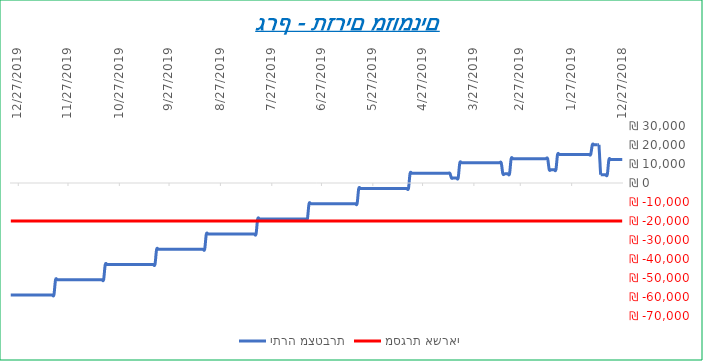
| Category | יתרה מצטברת | מסגרת אשראי |
|---|---|---|
| 2018-12-27 | 12345 | -20000 |
| 2018-12-28 | 12345 | -20000 |
| 2018-12-29 | 12345 | -20000 |
| 2018-12-30 | 12345 | -20000 |
| 2018-12-31 | 12345 | -20000 |
| 2019-01-01 | 12345 | -20000 |
| 2019-01-02 | 12345 | -20000 |
| 2019-01-03 | 12345 | -20000 |
| 2019-01-04 | 12345 | -20000 |
| 2019-01-05 | 4345 | -20000 |
| 2019-01-06 | 4345 | -20000 |
| 2019-01-07 | 4345 | -20000 |
| 2019-01-08 | 4345 | -20000 |
| 2019-01-09 | 4345 | -20000 |
| 2019-01-10 | 20145 | -20000 |
| 2019-01-11 | 20145 | -20000 |
| 2019-01-12 | 20145 | -20000 |
| 2019-01-13 | 20145 | -20000 |
| 2019-01-14 | 20145 | -20000 |
| 2019-01-15 | 15011 | -20000 |
| 2019-01-16 | 15011 | -20000 |
| 2019-01-17 | 15011 | -20000 |
| 2019-01-18 | 15011 | -20000 |
| 2019-01-19 | 15011 | -20000 |
| 2019-01-20 | 15011 | -20000 |
| 2019-01-21 | 15011 | -20000 |
| 2019-01-22 | 15011 | -20000 |
| 2019-01-23 | 15011 | -20000 |
| 2019-01-24 | 15011 | -20000 |
| 2019-01-25 | 15011 | -20000 |
| 2019-01-26 | 15011 | -20000 |
| 2019-01-27 | 15011 | -20000 |
| 2019-01-28 | 15011 | -20000 |
| 2019-01-29 | 15011 | -20000 |
| 2019-01-30 | 15011 | -20000 |
| 2019-01-31 | 15011 | -20000 |
| 2019-02-01 | 15011 | -20000 |
| 2019-02-02 | 15011 | -20000 |
| 2019-02-03 | 15011 | -20000 |
| 2019-02-04 | 15011 | -20000 |
| 2019-02-05 | 7011 | -20000 |
| 2019-02-06 | 7011 | -20000 |
| 2019-02-07 | 7011 | -20000 |
| 2019-02-08 | 7011 | -20000 |
| 2019-02-09 | 7011 | -20000 |
| 2019-02-10 | 12811 | -20000 |
| 2019-02-11 | 12811 | -20000 |
| 2019-02-12 | 12811 | -20000 |
| 2019-02-13 | 12811 | -20000 |
| 2019-02-14 | 12811 | -20000 |
| 2019-02-15 | 12811 | -20000 |
| 2019-02-16 | 12811 | -20000 |
| 2019-02-17 | 12811 | -20000 |
| 2019-02-18 | 12811 | -20000 |
| 2019-02-19 | 12811 | -20000 |
| 2019-02-20 | 12811 | -20000 |
| 2019-02-21 | 12811 | -20000 |
| 2019-02-22 | 12811 | -20000 |
| 2019-02-23 | 12811 | -20000 |
| 2019-02-24 | 12811 | -20000 |
| 2019-02-25 | 12811 | -20000 |
| 2019-02-26 | 12811 | -20000 |
| 2019-02-27 | 12811 | -20000 |
| 2019-02-28 | 12811 | -20000 |
| 2019-03-01 | 12811 | -20000 |
| 2019-03-02 | 12811 | -20000 |
| 2019-03-03 | 12811 | -20000 |
| 2019-03-04 | 12811 | -20000 |
| 2019-03-05 | 4811 | -20000 |
| 2019-03-06 | 4811 | -20000 |
| 2019-03-07 | 4811 | -20000 |
| 2019-03-08 | 4811 | -20000 |
| 2019-03-09 | 4811 | -20000 |
| 2019-03-10 | 10611 | -20000 |
| 2019-03-11 | 10611 | -20000 |
| 2019-03-12 | 10611 | -20000 |
| 2019-03-13 | 10611 | -20000 |
| 2019-03-14 | 10611 | -20000 |
| 2019-03-15 | 10611 | -20000 |
| 2019-03-16 | 10611 | -20000 |
| 2019-03-17 | 10611 | -20000 |
| 2019-03-18 | 10611 | -20000 |
| 2019-03-19 | 10611 | -20000 |
| 2019-03-20 | 10611 | -20000 |
| 2019-03-21 | 10611 | -20000 |
| 2019-03-22 | 10611 | -20000 |
| 2019-03-23 | 10611 | -20000 |
| 2019-03-24 | 10611 | -20000 |
| 2019-03-25 | 10611 | -20000 |
| 2019-03-26 | 10611 | -20000 |
| 2019-03-27 | 10611 | -20000 |
| 2019-03-28 | 10611 | -20000 |
| 2019-03-29 | 10611 | -20000 |
| 2019-03-30 | 10611 | -20000 |
| 2019-03-31 | 10611 | -20000 |
| 2019-04-01 | 10611 | -20000 |
| 2019-04-02 | 10611 | -20000 |
| 2019-04-03 | 10611 | -20000 |
| 2019-04-04 | 10611 | -20000 |
| 2019-04-05 | 2611 | -20000 |
| 2019-04-06 | 2611 | -20000 |
| 2019-04-07 | 2611 | -20000 |
| 2019-04-08 | 2611 | -20000 |
| 2019-04-09 | 2611 | -20000 |
| 2019-04-10 | 5111 | -20000 |
| 2019-04-11 | 5111 | -20000 |
| 2019-04-12 | 5111 | -20000 |
| 2019-04-13 | 5111 | -20000 |
| 2019-04-14 | 5111 | -20000 |
| 2019-04-15 | 5111 | -20000 |
| 2019-04-16 | 5111 | -20000 |
| 2019-04-17 | 5111 | -20000 |
| 2019-04-18 | 5111 | -20000 |
| 2019-04-19 | 5111 | -20000 |
| 2019-04-20 | 5111 | -20000 |
| 2019-04-21 | 5111 | -20000 |
| 2019-04-22 | 5111 | -20000 |
| 2019-04-23 | 5111 | -20000 |
| 2019-04-24 | 5111 | -20000 |
| 2019-04-25 | 5111 | -20000 |
| 2019-04-26 | 5111 | -20000 |
| 2019-04-27 | 5111 | -20000 |
| 2019-04-28 | 5111 | -20000 |
| 2019-04-29 | 5111 | -20000 |
| 2019-04-30 | 5111 | -20000 |
| 2019-05-01 | 5111 | -20000 |
| 2019-05-02 | 5111 | -20000 |
| 2019-05-03 | 5111 | -20000 |
| 2019-05-04 | 5111 | -20000 |
| 2019-05-05 | -2889 | -20000 |
| 2019-05-06 | -2889 | -20000 |
| 2019-05-07 | -2889 | -20000 |
| 2019-05-08 | -2889 | -20000 |
| 2019-05-09 | -2889 | -20000 |
| 2019-05-10 | -2889 | -20000 |
| 2019-05-11 | -2889 | -20000 |
| 2019-05-12 | -2889 | -20000 |
| 2019-05-13 | -2889 | -20000 |
| 2019-05-14 | -2889 | -20000 |
| 2019-05-15 | -2889 | -20000 |
| 2019-05-16 | -2889 | -20000 |
| 2019-05-17 | -2889 | -20000 |
| 2019-05-18 | -2889 | -20000 |
| 2019-05-19 | -2889 | -20000 |
| 2019-05-20 | -2889 | -20000 |
| 2019-05-21 | -2889 | -20000 |
| 2019-05-22 | -2889 | -20000 |
| 2019-05-23 | -2889 | -20000 |
| 2019-05-24 | -2889 | -20000 |
| 2019-05-25 | -2889 | -20000 |
| 2019-05-26 | -2889 | -20000 |
| 2019-05-27 | -2889 | -20000 |
| 2019-05-28 | -2889 | -20000 |
| 2019-05-29 | -2889 | -20000 |
| 2019-05-30 | -2889 | -20000 |
| 2019-05-31 | -2889 | -20000 |
| 2019-06-01 | -2889 | -20000 |
| 2019-06-02 | -2889 | -20000 |
| 2019-06-03 | -2889 | -20000 |
| 2019-06-04 | -2889 | -20000 |
| 2019-06-05 | -10889 | -20000 |
| 2019-06-06 | -10889 | -20000 |
| 2019-06-07 | -10889 | -20000 |
| 2019-06-08 | -10889 | -20000 |
| 2019-06-09 | -10889 | -20000 |
| 2019-06-10 | -10889 | -20000 |
| 2019-06-11 | -10889 | -20000 |
| 2019-06-12 | -10889 | -20000 |
| 2019-06-13 | -10889 | -20000 |
| 2019-06-14 | -10889 | -20000 |
| 2019-06-15 | -10889 | -20000 |
| 2019-06-16 | -10889 | -20000 |
| 2019-06-17 | -10889 | -20000 |
| 2019-06-18 | -10889 | -20000 |
| 2019-06-19 | -10889 | -20000 |
| 2019-06-20 | -10889 | -20000 |
| 2019-06-21 | -10889 | -20000 |
| 2019-06-22 | -10889 | -20000 |
| 2019-06-23 | -10889 | -20000 |
| 2019-06-24 | -10889 | -20000 |
| 2019-06-25 | -10889 | -20000 |
| 2019-06-26 | -10889 | -20000 |
| 2019-06-27 | -10889 | -20000 |
| 2019-06-28 | -10889 | -20000 |
| 2019-06-29 | -10889 | -20000 |
| 2019-06-30 | -10889 | -20000 |
| 2019-07-01 | -10889 | -20000 |
| 2019-07-02 | -10889 | -20000 |
| 2019-07-03 | -10889 | -20000 |
| 2019-07-04 | -10889 | -20000 |
| 2019-07-05 | -18889 | -20000 |
| 2019-07-06 | -18889 | -20000 |
| 2019-07-07 | -18889 | -20000 |
| 2019-07-08 | -18889 | -20000 |
| 2019-07-09 | -18889 | -20000 |
| 2019-07-10 | -18889 | -20000 |
| 2019-07-11 | -18889 | -20000 |
| 2019-07-12 | -18889 | -20000 |
| 2019-07-13 | -18889 | -20000 |
| 2019-07-14 | -18889 | -20000 |
| 2019-07-15 | -18889 | -20000 |
| 2019-07-16 | -18889 | -20000 |
| 2019-07-17 | -18889 | -20000 |
| 2019-07-18 | -18889 | -20000 |
| 2019-07-19 | -18889 | -20000 |
| 2019-07-20 | -18889 | -20000 |
| 2019-07-21 | -18889 | -20000 |
| 2019-07-22 | -18889 | -20000 |
| 2019-07-23 | -18889 | -20000 |
| 2019-07-24 | -18889 | -20000 |
| 2019-07-25 | -18889 | -20000 |
| 2019-07-26 | -18889 | -20000 |
| 2019-07-27 | -18889 | -20000 |
| 2019-07-28 | -18889 | -20000 |
| 2019-07-29 | -18889 | -20000 |
| 2019-07-30 | -18889 | -20000 |
| 2019-07-31 | -18889 | -20000 |
| 2019-08-01 | -18889 | -20000 |
| 2019-08-02 | -18889 | -20000 |
| 2019-08-03 | -18889 | -20000 |
| 2019-08-04 | -18889 | -20000 |
| 2019-08-05 | -26889 | -20000 |
| 2019-08-06 | -26889 | -20000 |
| 2019-08-07 | -26889 | -20000 |
| 2019-08-08 | -26889 | -20000 |
| 2019-08-09 | -26889 | -20000 |
| 2019-08-10 | -26889 | -20000 |
| 2019-08-11 | -26889 | -20000 |
| 2019-08-12 | -26889 | -20000 |
| 2019-08-13 | -26889 | -20000 |
| 2019-08-14 | -26889 | -20000 |
| 2019-08-15 | -26889 | -20000 |
| 2019-08-16 | -26889 | -20000 |
| 2019-08-17 | -26889 | -20000 |
| 2019-08-18 | -26889 | -20000 |
| 2019-08-19 | -26889 | -20000 |
| 2019-08-20 | -26889 | -20000 |
| 2019-08-21 | -26889 | -20000 |
| 2019-08-22 | -26889 | -20000 |
| 2019-08-23 | -26889 | -20000 |
| 2019-08-24 | -26889 | -20000 |
| 2019-08-25 | -26889 | -20000 |
| 2019-08-26 | -26889 | -20000 |
| 2019-08-27 | -26889 | -20000 |
| 2019-08-28 | -26889 | -20000 |
| 2019-08-29 | -26889 | -20000 |
| 2019-08-30 | -26889 | -20000 |
| 2019-08-31 | -26889 | -20000 |
| 2019-09-01 | -26889 | -20000 |
| 2019-09-02 | -26889 | -20000 |
| 2019-09-03 | -26889 | -20000 |
| 2019-09-04 | -26889 | -20000 |
| 2019-09-05 | -34889 | -20000 |
| 2019-09-06 | -34889 | -20000 |
| 2019-09-07 | -34889 | -20000 |
| 2019-09-08 | -34889 | -20000 |
| 2019-09-09 | -34889 | -20000 |
| 2019-09-10 | -34889 | -20000 |
| 2019-09-11 | -34889 | -20000 |
| 2019-09-12 | -34889 | -20000 |
| 2019-09-13 | -34889 | -20000 |
| 2019-09-14 | -34889 | -20000 |
| 2019-09-15 | -34889 | -20000 |
| 2019-09-16 | -34889 | -20000 |
| 2019-09-17 | -34889 | -20000 |
| 2019-09-18 | -34889 | -20000 |
| 2019-09-19 | -34889 | -20000 |
| 2019-09-20 | -34889 | -20000 |
| 2019-09-21 | -34889 | -20000 |
| 2019-09-22 | -34889 | -20000 |
| 2019-09-23 | -34889 | -20000 |
| 2019-09-24 | -34889 | -20000 |
| 2019-09-25 | -34889 | -20000 |
| 2019-09-26 | -34889 | -20000 |
| 2019-09-27 | -34889 | -20000 |
| 2019-09-28 | -34889 | -20000 |
| 2019-09-29 | -34889 | -20000 |
| 2019-09-30 | -34889 | -20000 |
| 2019-10-01 | -34889 | -20000 |
| 2019-10-02 | -34889 | -20000 |
| 2019-10-03 | -34889 | -20000 |
| 2019-10-04 | -34889 | -20000 |
| 2019-10-05 | -42889 | -20000 |
| 2019-10-06 | -42889 | -20000 |
| 2019-10-07 | -42889 | -20000 |
| 2019-10-08 | -42889 | -20000 |
| 2019-10-09 | -42889 | -20000 |
| 2019-10-10 | -42889 | -20000 |
| 2019-10-11 | -42889 | -20000 |
| 2019-10-12 | -42889 | -20000 |
| 2019-10-13 | -42889 | -20000 |
| 2019-10-14 | -42889 | -20000 |
| 2019-10-15 | -42889 | -20000 |
| 2019-10-16 | -42889 | -20000 |
| 2019-10-17 | -42889 | -20000 |
| 2019-10-18 | -42889 | -20000 |
| 2019-10-19 | -42889 | -20000 |
| 2019-10-20 | -42889 | -20000 |
| 2019-10-21 | -42889 | -20000 |
| 2019-10-22 | -42889 | -20000 |
| 2019-10-23 | -42889 | -20000 |
| 2019-10-24 | -42889 | -20000 |
| 2019-10-25 | -42889 | -20000 |
| 2019-10-26 | -42889 | -20000 |
| 2019-10-27 | -42889 | -20000 |
| 2019-10-28 | -42889 | -20000 |
| 2019-10-29 | -42889 | -20000 |
| 2019-10-30 | -42889 | -20000 |
| 2019-10-31 | -42889 | -20000 |
| 2019-11-01 | -42889 | -20000 |
| 2019-11-02 | -42889 | -20000 |
| 2019-11-03 | -42889 | -20000 |
| 2019-11-04 | -42889 | -20000 |
| 2019-11-05 | -50889 | -20000 |
| 2019-11-06 | -50889 | -20000 |
| 2019-11-07 | -50889 | -20000 |
| 2019-11-08 | -50889 | -20000 |
| 2019-11-09 | -50889 | -20000 |
| 2019-11-10 | -50889 | -20000 |
| 2019-11-11 | -50889 | -20000 |
| 2019-11-12 | -50889 | -20000 |
| 2019-11-13 | -50889 | -20000 |
| 2019-11-14 | -50889 | -20000 |
| 2019-11-15 | -50889 | -20000 |
| 2019-11-16 | -50889 | -20000 |
| 2019-11-17 | -50889 | -20000 |
| 2019-11-18 | -50889 | -20000 |
| 2019-11-19 | -50889 | -20000 |
| 2019-11-20 | -50889 | -20000 |
| 2019-11-21 | -50889 | -20000 |
| 2019-11-22 | -50889 | -20000 |
| 2019-11-23 | -50889 | -20000 |
| 2019-11-24 | -50889 | -20000 |
| 2019-11-25 | -50889 | -20000 |
| 2019-11-26 | -50889 | -20000 |
| 2019-11-27 | -50889 | -20000 |
| 2019-11-28 | -50889 | -20000 |
| 2019-11-29 | -50889 | -20000 |
| 2019-11-30 | -50889 | -20000 |
| 2019-12-01 | -50889 | -20000 |
| 2019-12-02 | -50889 | -20000 |
| 2019-12-03 | -50889 | -20000 |
| 2019-12-04 | -50889 | -20000 |
| 2019-12-05 | -58889 | -20000 |
| 2019-12-06 | -58889 | -20000 |
| 2019-12-07 | -58889 | -20000 |
| 2019-12-08 | -58889 | -20000 |
| 2019-12-09 | -58889 | -20000 |
| 2019-12-10 | -58889 | -20000 |
| 2019-12-11 | -58889 | -20000 |
| 2019-12-12 | -58889 | -20000 |
| 2019-12-13 | -58889 | -20000 |
| 2019-12-14 | -58889 | -20000 |
| 2019-12-15 | -58889 | -20000 |
| 2019-12-16 | -58889 | -20000 |
| 2019-12-17 | -58889 | -20000 |
| 2019-12-18 | -58889 | -20000 |
| 2019-12-19 | -58889 | -20000 |
| 2019-12-20 | -58889 | -20000 |
| 2019-12-21 | -58889 | -20000 |
| 2019-12-22 | -58889 | -20000 |
| 2019-12-23 | -58889 | -20000 |
| 2019-12-24 | -58889 | -20000 |
| 2019-12-25 | -58889 | -20000 |
| 2019-12-26 | -58889 | -20000 |
| 2019-12-27 | -58889 | -20000 |
| 2019-12-28 | -58889 | -20000 |
| 2019-12-29 | -58889 | -20000 |
| 2019-12-30 | -58889 | -20000 |
| 2019-12-31 | -58889 | -20000 |